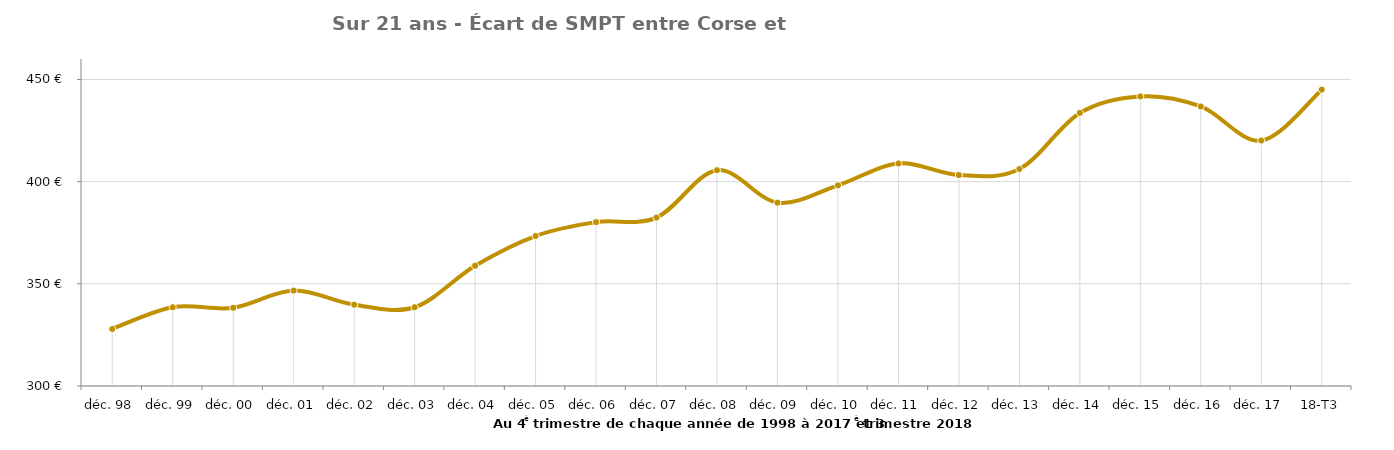
| Category | Différence Corse-Métropole |
|---|---|
| déc. 98 | 327.907 |
| déc. 99 | 338.547 |
| déc. 00 | 338.257 |
| déc. 01 | 346.693 |
| déc. 02 | 339.784 |
| déc. 03 | 338.542 |
| déc. 04 | 358.826 |
| déc. 05 | 373.372 |
| déc. 06 | 380.183 |
| déc. 07 | 382.42 |
| déc. 08 | 405.578 |
| déc. 09 | 389.716 |
| déc. 10 | 398.185 |
| déc. 11 | 408.879 |
| déc. 12 | 403.224 |
| déc. 13 | 406.154 |
| déc. 14 | 433.614 |
| déc. 15 | 441.698 |
| déc. 16 | 436.771 |
| déc. 17 | 420.099 |
| 18-T3 | 445 |